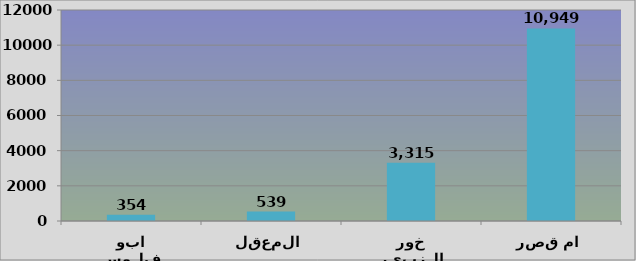
| Category | Series 0 |
|---|---|
| ابو فلوس | 354 |
| المعقل | 539 |
| خور الزبير | 3315 |
| ام قصر | 10949 |